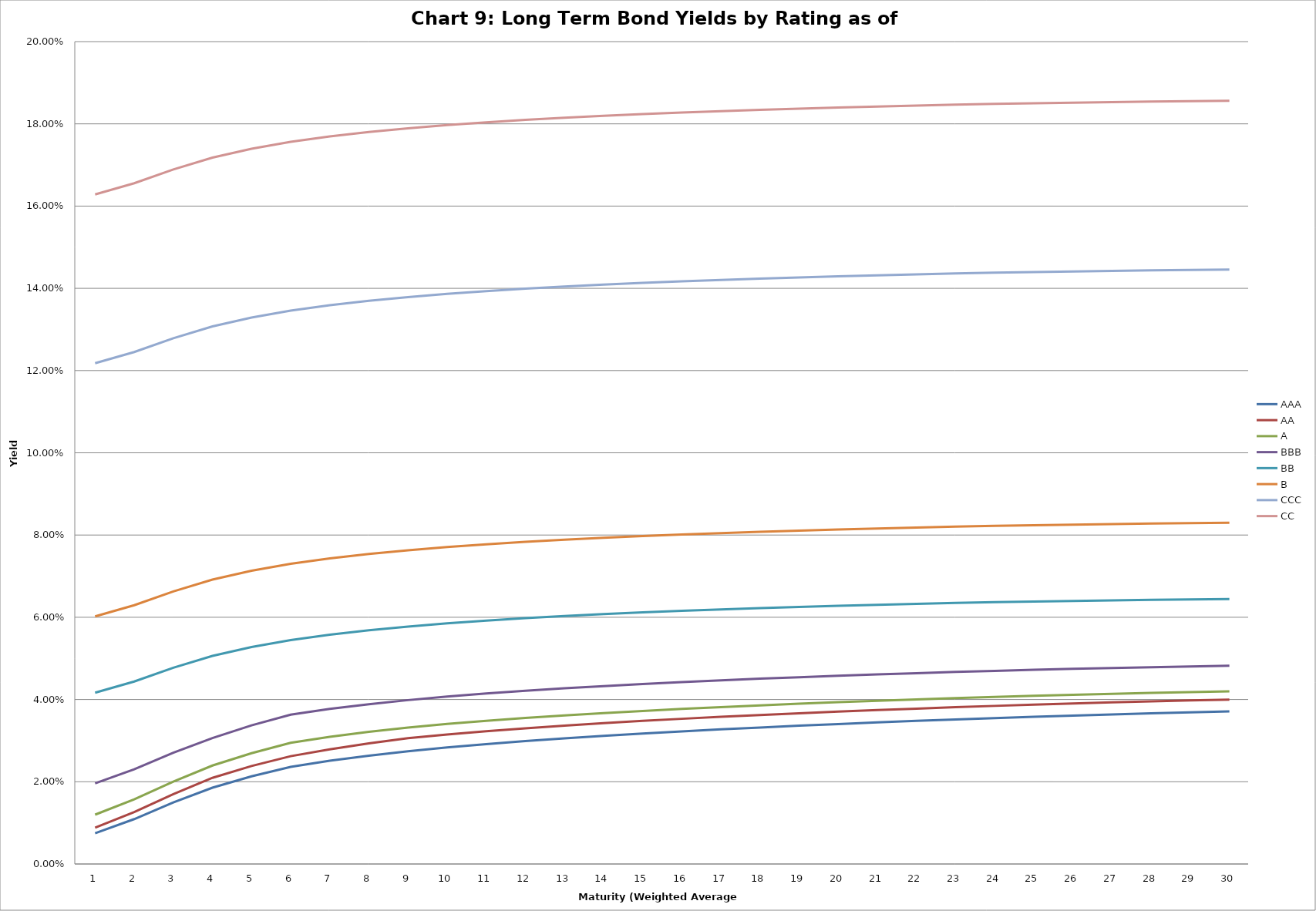
| Category | AAA | AA | A | BBB | BB | B | CCC | CC |
|---|---|---|---|---|---|---|---|---|
| 0 | 0.007 | 0.009 | 0.012 | 0.02 | 0.042 | 0.06 | 0.122 | 0.163 |
| 1 | 0.011 | 0.013 | 0.016 | 0.023 | 0.044 | 0.063 | 0.125 | 0.166 |
| 2 | 0.015 | 0.017 | 0.02 | 0.027 | 0.048 | 0.066 | 0.128 | 0.169 |
| 3 | 0.019 | 0.021 | 0.024 | 0.031 | 0.051 | 0.069 | 0.131 | 0.172 |
| 4 | 0.021 | 0.024 | 0.027 | 0.034 | 0.053 | 0.071 | 0.133 | 0.174 |
| 5 | 0.024 | 0.026 | 0.029 | 0.036 | 0.054 | 0.073 | 0.135 | 0.176 |
| 6 | 0.025 | 0.028 | 0.031 | 0.038 | 0.056 | 0.074 | 0.136 | 0.177 |
| 7 | 0.026 | 0.029 | 0.032 | 0.039 | 0.057 | 0.075 | 0.137 | 0.178 |
| 8 | 0.027 | 0.031 | 0.033 | 0.04 | 0.058 | 0.076 | 0.138 | 0.179 |
| 9 | 0.028 | 0.031 | 0.034 | 0.041 | 0.059 | 0.077 | 0.139 | 0.18 |
| 10 | 0.029 | 0.032 | 0.035 | 0.041 | 0.059 | 0.078 | 0.139 | 0.18 |
| 11 | 0.03 | 0.033 | 0.036 | 0.042 | 0.06 | 0.078 | 0.14 | 0.181 |
| 12 | 0.031 | 0.034 | 0.036 | 0.043 | 0.06 | 0.079 | 0.14 | 0.181 |
| 13 | 0.031 | 0.034 | 0.037 | 0.043 | 0.061 | 0.079 | 0.141 | 0.182 |
| 14 | 0.032 | 0.035 | 0.037 | 0.044 | 0.061 | 0.08 | 0.141 | 0.182 |
| 15 | 0.032 | 0.035 | 0.038 | 0.044 | 0.062 | 0.08 | 0.142 | 0.183 |
| 16 | 0.033 | 0.036 | 0.038 | 0.045 | 0.062 | 0.08 | 0.142 | 0.183 |
| 17 | 0.033 | 0.036 | 0.039 | 0.045 | 0.062 | 0.081 | 0.142 | 0.183 |
| 18 | 0.034 | 0.037 | 0.039 | 0.045 | 0.063 | 0.081 | 0.143 | 0.184 |
| 19 | 0.034 | 0.037 | 0.039 | 0.046 | 0.063 | 0.081 | 0.143 | 0.184 |
| 20 | 0.034 | 0.037 | 0.04 | 0.046 | 0.063 | 0.082 | 0.143 | 0.184 |
| 21 | 0.035 | 0.038 | 0.04 | 0.046 | 0.063 | 0.082 | 0.143 | 0.184 |
| 22 | 0.035 | 0.038 | 0.04 | 0.047 | 0.063 | 0.082 | 0.144 | 0.185 |
| 23 | 0.035 | 0.038 | 0.041 | 0.047 | 0.064 | 0.082 | 0.144 | 0.185 |
| 24 | 0.036 | 0.039 | 0.041 | 0.047 | 0.064 | 0.082 | 0.144 | 0.185 |
| 25 | 0.036 | 0.039 | 0.041 | 0.047 | 0.064 | 0.083 | 0.144 | 0.185 |
| 26 | 0.036 | 0.039 | 0.041 | 0.048 | 0.064 | 0.083 | 0.144 | 0.185 |
| 27 | 0.037 | 0.04 | 0.042 | 0.048 | 0.064 | 0.083 | 0.144 | 0.185 |
| 28 | 0.037 | 0.04 | 0.042 | 0.048 | 0.064 | 0.083 | 0.144 | 0.186 |
| 29 | 0.037 | 0.04 | 0.042 | 0.048 | 0.064 | 0.083 | 0.145 | 0.186 |